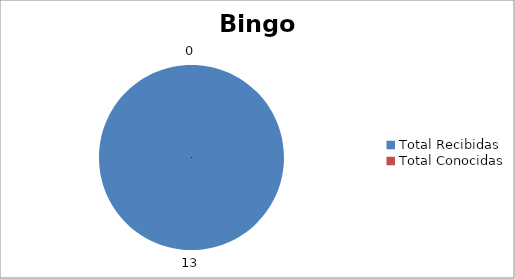
| Category | Series 0 |
|---|---|
| Total Recibidas | 13 |
| Total Conocidas | 0 |